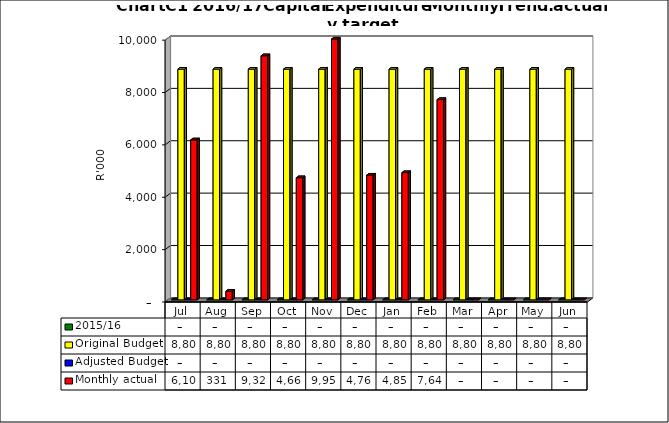
| Category | 2015/16 | Original Budget | Adjusted Budget | Monthly actual |
|---|---|---|---|---|
| Jul | 0 | 8808585.26 | 0 | 6108587 |
| Aug | 0 | 8808585.26 | 0 | 330675 |
| Sep | 0 | 8808585.26 | 0 | 9321519 |
| Oct | 0 | 8808585.26 | 0 | 4663933 |
| Nov | 0 | 8808585.26 | 0 | 9959155 |
| Dec | 0 | 8808585.26 | 0 | 4761825 |
| Jan | 0 | 8808585.26 | 0 | 4858051 |
| Feb | 0 | 8808585.26 | 0 | 7648776 |
| Mar | 0 | 8808585.26 | 0 | 0 |
| Apr | 0 | 8808585.26 | 0 | 0 |
| May | 0 | 8808585.26 | 0 | 0 |
| Jun | 0 | 8808585.26 | 0 | 0 |